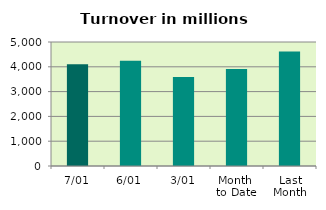
| Category | Series 0 |
|---|---|
| 7/01 | 4097.98 |
| 6/01 | 4243.26 |
| 3/01 | 3585.961 |
| Month 
to Date | 3915.757 |
| Last
Month | 4613.793 |